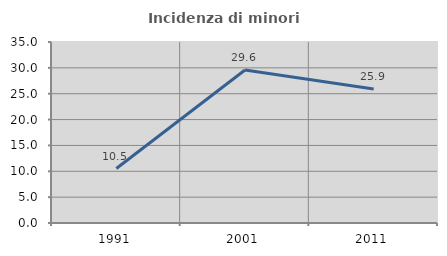
| Category | Incidenza di minori stranieri |
|---|---|
| 1991.0 | 10.526 |
| 2001.0 | 29.577 |
| 2011.0 | 25.914 |